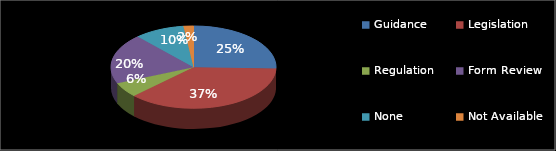
| Category | Series 0 |
|---|---|
| Guidance | 13 |
| Legislation | 19 |
| Regulation | 3 |
| Form Review | 10 |
| None | 5 |
| Not Available | 1 |